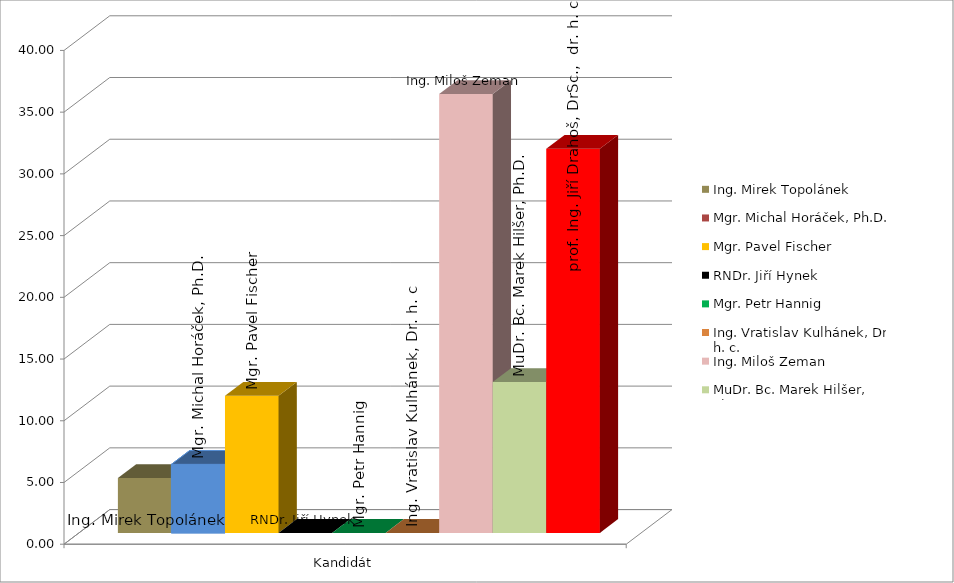
| Category | Ing. Mirek Topolánek | Mgr. Michal Horáček, Ph.D. | Mgr. Pavel Fischer | RNDr. Jiří Hynek | Mgr. Petr Hannig | Ing. Vratislav Kulhánek, Dr. h. c. | Ing. Miloš Zeman | MuDr. Bc. Marek Hilšer, Ph.D. | prof. Ing. Jiří Drahoš, DrSc.,  dr. h. c. |
|---|---|---|---|---|---|---|---|---|---|
| 0 | 4.444 | 5.556 | 11.111 | 0 | 0 | 0 | 35.556 | 12.222 | 31.111 |